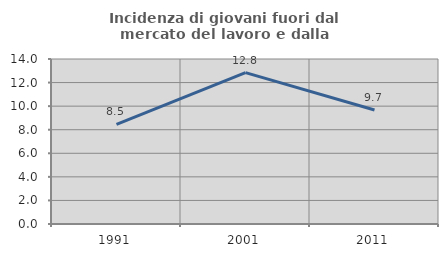
| Category | Incidenza di giovani fuori dal mercato del lavoro e dalla formazione  |
|---|---|
| 1991.0 | 8.451 |
| 2001.0 | 12.844 |
| 2011.0 | 9.677 |